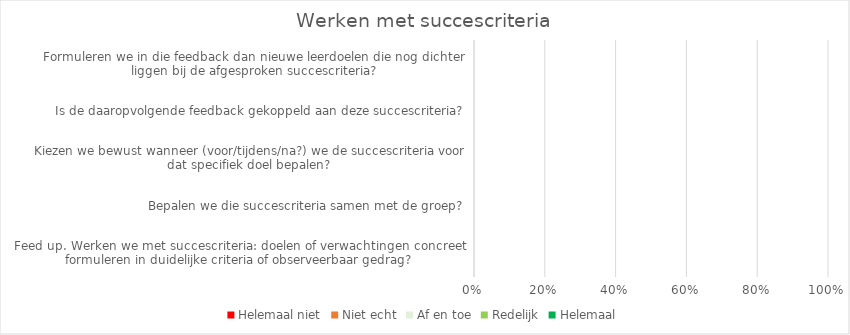
| Category | Helemaal niet | Niet echt | Af en toe | Redelijk | Helemaal |
|---|---|---|---|---|---|
| Feed up. Werken we met succescriteria: doelen of verwachtingen concreet formuleren in duidelijke criteria of observeerbaar gedrag? | 0 | 0 | 0 | 0 | 0 |
| Bepalen we die succescriteria samen met de groep? | 0 | 0 | 0 | 0 | 0 |
| Kiezen we bewust wanneer (voor/tijdens/na?) we de succescriteria voor dat specifiek doel bepalen? | 0 | 0 | 0 | 0 | 0 |
| Is de daaropvolgende feedback gekoppeld aan deze succescriteria? | 0 | 0 | 0 | 0 | 0 |
| Formuleren we in die feedback dan nieuwe leerdoelen die nog dichter liggen bij de afgesproken succescriteria? | 0 | 0 | 0 | 0 | 0 |